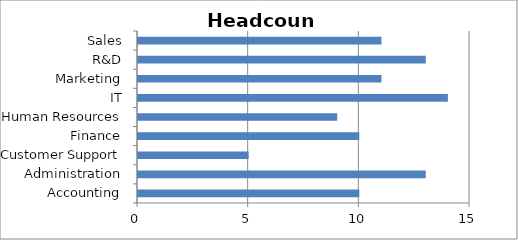
| Category | Series 0 |
|---|---|
| Accounting | 10 |
| Administration | 13 |
| Customer Support | 5 |
| Finance | 10 |
| Human Resources | 9 |
| IT | 14 |
| Marketing | 11 |
| R&D | 13 |
| Sales | 11 |